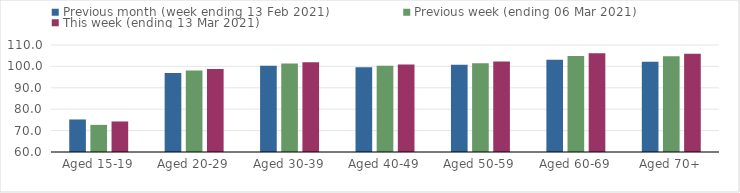
| Category | Previous month (week ending 13 Feb 2021) | Previous week (ending 06 Mar 2021) | This week (ending 13 Mar 2021) |
|---|---|---|---|
| Aged 15-19 | 75.2 | 72.68 | 74.27 |
| Aged 20-29 | 96.95 | 98.07 | 98.79 |
| Aged 30-39 | 100.35 | 101.32 | 101.94 |
| Aged 40-49 | 99.6 | 100.26 | 100.89 |
| Aged 50-59 | 100.75 | 101.47 | 102.28 |
| Aged 60-69 | 103.12 | 104.87 | 106.12 |
| Aged 70+ | 102.22 | 104.69 | 105.88 |